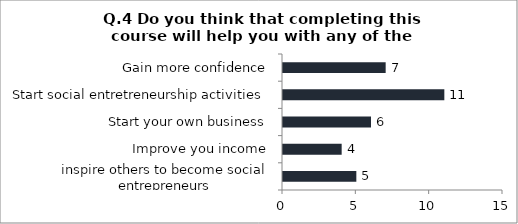
| Category | Q.4 Do you think that completing this course will help you with any of the followoing ? |
|---|---|
| inspire others to become social entrepreneurs | 5 |
| Improve you income | 4 |
| Start your own business | 6 |
| Start social entretreneurship activities | 11 |
| Gain more confidence | 7 |